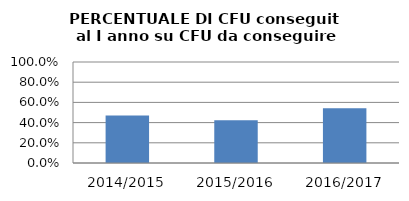
| Category | 2014/2015 2015/2016 2016/2017 |
|---|---|
| 2014/2015 | 0.471 |
| 2015/2016 | 0.424 |
| 2016/2017 | 0.542 |